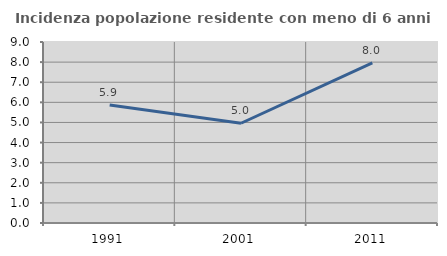
| Category | Incidenza popolazione residente con meno di 6 anni |
|---|---|
| 1991.0 | 5.866 |
| 2001.0 | 4.959 |
| 2011.0 | 7.965 |